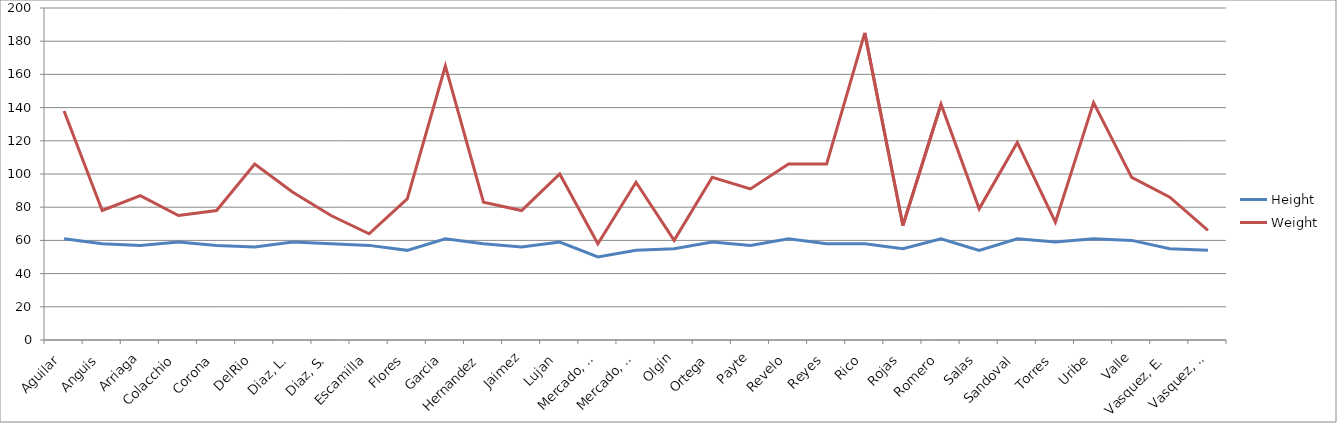
| Category | Height | Weight |
|---|---|---|
| Aguilar | 61 | 138 |
| Anguis | 58 | 78 |
| Arriaga | 57 | 87 |
| Colacchio | 59 | 75 |
| Corona | 57 | 78 |
| DelRio | 56 | 106 |
| Diaz, L. | 59 | 89 |
| Diaz, S. | 58 | 75 |
| Escamilla | 57 | 64 |
| Flores | 54 | 85 |
| Garcia | 61 | 165 |
| Hernandez | 58 | 83 |
| Jaimez | 56 | 78 |
| Lujan | 59 | 100 |
| Mercado, F. | 50 | 58 |
| Mercado, K. | 54 | 95 |
| Olgin | 55 | 60 |
| Ortega | 59 | 98 |
| Payte | 57 | 91 |
| Revelo | 61 | 106 |
| Reyes | 58 | 106 |
| Rico | 58 | 185 |
| Rojas | 55 | 69 |
| Romero | 61 | 142 |
| Salas | 54 | 79 |
| Sandoval | 61 | 119 |
| Torres | 59 | 71 |
| Uribe | 61 | 143 |
| Valle | 60 | 98 |
| Vasquez, E. | 55 | 86 |
| Vasquez, M. | 54 | 66 |